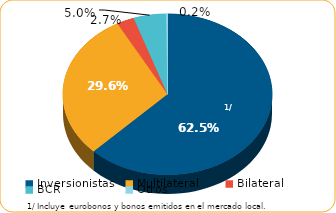
| Category | Series 0 |
|---|---|
| Inversionistas | 8750.6 |
| Multilateral | 4148 |
| Bilateral | 377.7 |
| BCR | 704.3 |
| Otros | 31.4 |